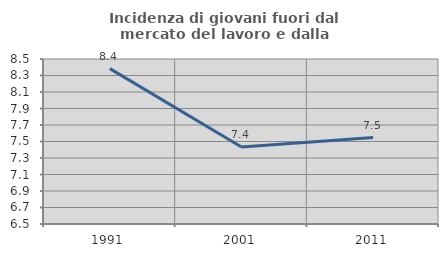
| Category | Incidenza di giovani fuori dal mercato del lavoro e dalla formazione  |
|---|---|
| 1991.0 | 8.383 |
| 2001.0 | 7.432 |
| 2011.0 | 7.547 |